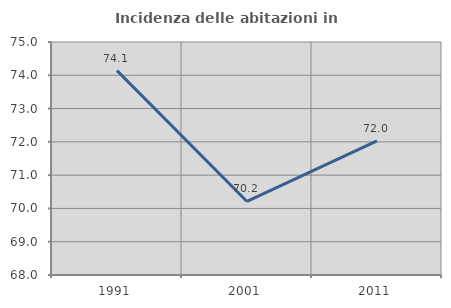
| Category | Incidenza delle abitazioni in proprietà  |
|---|---|
| 1991.0 | 74.141 |
| 2001.0 | 70.209 |
| 2011.0 | 72.026 |